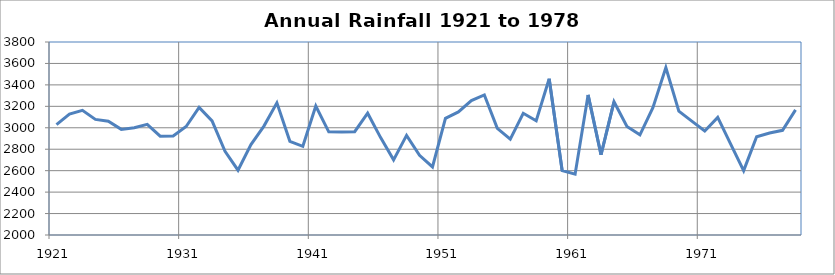
| Category | Annual Rainfall |
|---|---|
| 1921.0 | 3029.5 |
| 1922.0 | 3128.1 |
| 1923.0 | 3162.7 |
| 1924.0 | 3077.9 |
| 1925.0 | 3061.5 |
| 1926.0 | 2985 |
| 1927.0 | 3000.2 |
| 1928.0 | 3031.8 |
| 1929.0 | 2922.1 |
| 1930.0 | 2923.5 |
| 1931.0 | 3011.7 |
| 1932.0 | 3189.7 |
| 1933.0 | 3063.9 |
| 1934.0 | 2781 |
| 1935.0 | 2604.2 |
| 1936.0 | 2842.9 |
| 1937.0 | 3015.7 |
| 1938.0 | 3232.5 |
| 1939.0 | 2874.1 |
| 1940.0 | 2827 |
| 1941.0 | 3203 |
| 1942.0 | 2962 |
| 1943.0 | 2961.4 |
| 1944.0 | 2963.3 |
| 1945.0 | 3136.2 |
| 1946.0 | 2908.5 |
| 1947.0 | 2701 |
| 1948.0 | 2929.5 |
| 1949.0 | 2742.6 |
| 1950.0 | 2634.8 |
| 1951.0 | 3088.6 |
| 1952.0 | 3147.4 |
| 1953.0 | 3253 |
| 1954.0 | 3306.1 |
| 1955.0 | 2994.4 |
| 1956.0 | 2894.6 |
| 1957.0 | 3135.3 |
| 1958.0 | 3065.6 |
| 1959.0 | 3457.6 |
| 1960.0 | 2601.5 |
| 1961.0 | 2567.8 |
| 1962.0 | 3306.3 |
| 1963.0 | 2748.5 |
| 1964.0 | 3242 |
| 1965.0 | 3011.3 |
| 1966.0 | 2934.4 |
| 1967.0 | 3187.4 |
| 1968.0 | 3561.8 |
| 1969.0 | 3155.2 |
| 1970.0 | 3062.2 |
| 1971.0 | 2970.3 |
| 1972.0 | 3096.3 |
| 1973.0 | 2847.7 |
| 1974.0 | 2600.1 |
| 1975.0 | 2916.3 |
| 1976.0 | 2951.4 |
| 1977.0 | 2976.2 |
| 1978.0 | 3166.8 |